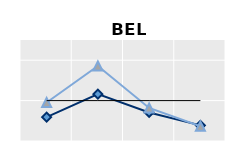
| Category | Foreign-born | Native-born | Series 1 |
|---|---|---|---|
| 15-24 | 0.591 | 0.952 | 1 |
| 25-54 | 1.161 | 1.856 | 1 |
| 55-64 | 0.706 | 0.817 | 1 |
| 65+ | 0.387 | 0.365 | 1 |